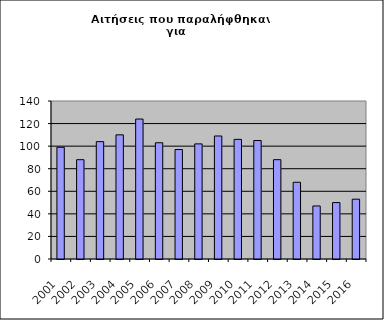
| Category | Series 1 |
|---|---|
| 2001.0 | 99 |
| 2002.0 | 88 |
| 2003.0 | 104 |
| 2004.0 | 110 |
| 2005.0 | 124 |
| 2006.0 | 103 |
| 2007.0 | 97 |
| 2008.0 | 102 |
| 2009.0 | 109 |
| 2010.0 | 106 |
| 2011.0 | 105 |
| 2012.0 | 88 |
| 2013.0 | 68 |
| 2014.0 | 47 |
| 2015.0 | 50 |
| 2016.0 | 53 |